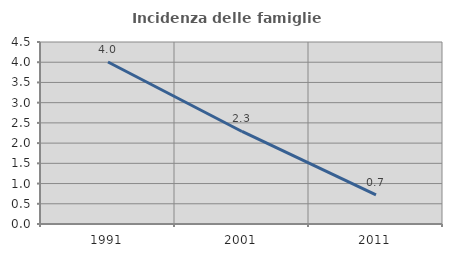
| Category | Incidenza delle famiglie numerose |
|---|---|
| 1991.0 | 4.006 |
| 2001.0 | 2.288 |
| 2011.0 | 0.721 |